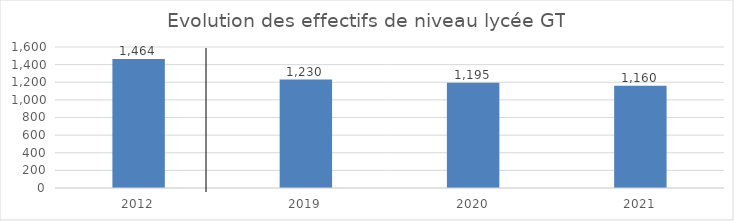
| Category | Series 0 |
|---|---|
| 2012.0 | 1464 |
| 2019.0 | 1230 |
| 2020.0 | 1195 |
| 2021.0 | 1160 |